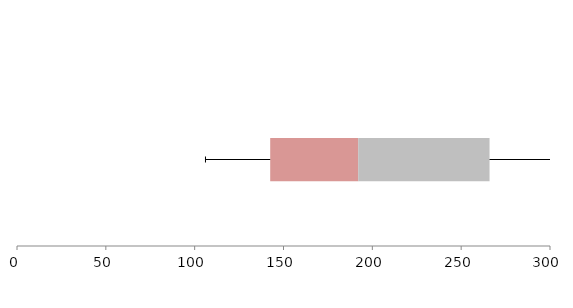
| Category | Series 1 | Series 2 | Series 3 |
|---|---|---|---|
| 0 | 142.517 | 49.533 | 73.925 |